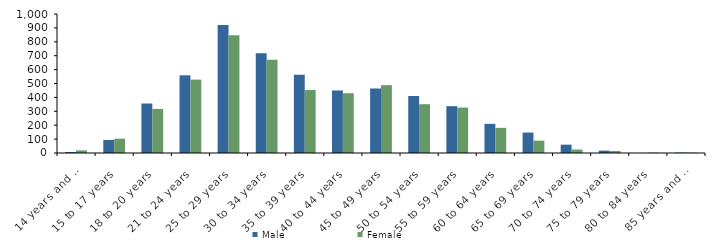
| Category | Male | Female |
|---|---|---|
| 14 years and under | 7 | 19 |
| 15 to 17 years | 94 | 103 |
| 18 to 20 years | 356 | 317 |
| 21 to 24 years | 559 | 528 |
| 25 to 29 years | 920 | 847 |
| 30 to 34 years | 717 | 671 |
| 35 to 39 years | 563 | 453 |
| 40 to 44 years | 450 | 430 |
| 45 to 49 years | 464 | 488 |
| 50 to 54 years | 410 | 351 |
| 55 to 59 years | 337 | 327 |
| 60 to 64 years | 210 | 181 |
| 65 to 69 years | 147 | 89 |
| 70 to 74 years | 60 | 25 |
| 75 to 79 years | 17 | 14 |
| 80 to 84 years | 0 | 3 |
| 85 years and over | 3 | 3 |